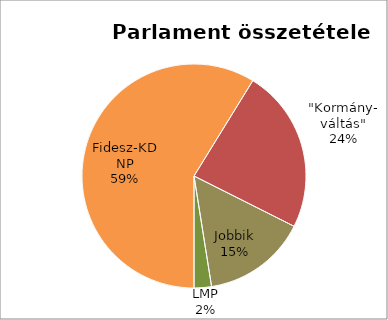
| Category | Fidesz-KDNP "Kormány-
váltás" Jobbik LMP |
|---|---|
| Fidesz-KDNP | 117 |
| "Kormány-
váltás" | 47 |
| Jobbik | 30 |
| LMP | 5 |